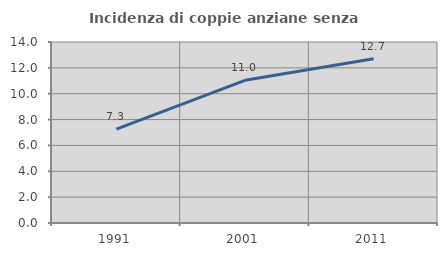
| Category | Incidenza di coppie anziane senza figli  |
|---|---|
| 1991.0 | 7.269 |
| 2001.0 | 11.037 |
| 2011.0 | 12.705 |